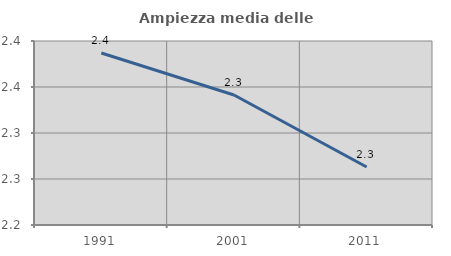
| Category | Ampiezza media delle famiglie |
|---|---|
| 1991.0 | 2.387 |
| 2001.0 | 2.341 |
| 2011.0 | 2.263 |